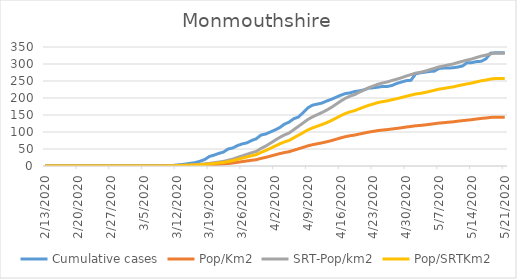
| Category | Cumulative cases | Pop/Km2 | SRT-Pop/km2 | Pop/SRTKm2 |
|---|---|---|---|---|
| 5/21/20 | 333 | 143.708 | 331.858 | 257.276 |
| 5/20/20 | 333 | 143.708 | 331.858 | 257.276 |
| 5/19/20 | 333 | 143.675 | 331.78 | 257.215 |
| 5/18/20 | 332 | 142.887 | 329.961 | 255.805 |
| 5/17/20 | 315 | 141.21 | 326.089 | 252.803 |
| 5/16/20 | 308 | 139.961 | 323.205 | 250.567 |
| 5/15/20 | 307 | 138.206 | 319.151 | 247.425 |
| 5/14/20 | 304 | 136.259 | 314.655 | 243.939 |
| 5/13/20 | 304 | 134.909 | 311.537 | 241.522 |
| 5/12/20 | 294 | 133.356 | 307.951 | 238.742 |
| 5/11/20 | 291 | 131.814 | 304.391 | 235.982 |
| 5/10/20 | 289 | 129.901 | 299.974 | 232.557 |
| 5/9/20 | 288 | 128.787 | 297.401 | 230.563 |
| 5/8/20 | 288 | 127.392 | 294.179 | 228.065 |
| 5/7/20 | 287 | 126.267 | 291.581 | 226.05 |
| 5/6/20 | 279 | 124.41 | 287.293 | 222.726 |
| 5/5/20 | 278 | 122.553 | 283.005 | 219.402 |
| 5/4/20 | 276 | 120.764 | 278.874 | 216.199 |
| 5/3/20 | 274 | 119.324 | 275.548 | 213.621 |
| 5/2/20 | 271 | 118.266 | 273.105 | 211.727 |
| 5/1/20 | 252 | 116.387 | 268.766 | 208.363 |
| 4/30/20 | 251 | 114.609 | 264.66 | 205.18 |
| 4/29/20 | 247 | 112.448 | 259.671 | 201.312 |
| 4/28/20 | 243 | 110.614 | 255.435 | 198.028 |
| 4/27/20 | 237 | 108.971 | 251.641 | 195.087 |
| 4/26/20 | 234 | 107.126 | 247.38 | 191.783 |
| 4/25/20 | 234 | 105.787 | 244.287 | 189.386 |
| 4/24/20 | 232 | 104.268 | 240.779 | 186.666 |
| 4/23/20 | 230 | 101.938 | 235.4 | 182.496 |
| 4/22/20 | 229 | 99.71 | 230.255 | 178.507 |
| 4/21/20 | 224 | 96.886 | 223.733 | 173.451 |
| 4/20/20 | 221 | 94.039 | 217.159 | 168.354 |
| 4/19/20 | 219 | 90.944 | 210.013 | 162.814 |
| 4/18/20 | 215 | 88.941 | 205.387 | 159.228 |
| 4/17/20 | 213 | 86.207 | 199.073 | 154.333 |
| 4/16/20 | 208 | 82.584 | 190.706 | 147.846 |
| 4/15/20 | 202 | 78.544 | 181.377 | 140.614 |
| 4/14/20 | 196 | 74.549 | 172.152 | 133.463 |
| 4/13/20 | 191 | 71.061 | 164.097 | 127.218 |
| 4/12/20 | 185 | 68.056 | 157.159 | 121.839 |
| 4/11/20 | 182 | 65.322 | 150.844 | 116.943 |
| 4/10/20 | 179 | 62.576 | 144.504 | 112.028 |
| 4/9/20 | 171 | 59.201 | 136.708 | 105.984 |
| 4/8/20 | 157 | 54.812 | 126.574 | 98.128 |
| 4/7/20 | 144 | 50.502 | 116.622 | 90.412 |
| 4/6/20 | 139 | 46.271 | 106.851 | 82.837 |
| 4/5/20 | 129 | 42.006 | 97.003 | 75.202 |
| 4/4/20 | 123 | 39.52 | 91.26 | 70.75 |
| 4/3/20 | 113 | 36.358 | 83.958 | 65.089 |
| 4/2/20 | 106 | 32.712 | 75.539 | 58.562 |
| 4/1/20 | 100 | 28.964 | 66.886 | 51.854 |
| 3/31/20 | 94 | 25.364 | 58.571 | 45.407 |
| 3/30/20 | 91 | 22.314 | 51.529 | 39.948 |
| 3/29/20 | 80 | 18.556 | 42.85 | 33.22 |
| 3/28/20 | 75 | 16.8 | 38.796 | 30.077 |
| 3/27/20 | 68 | 14.932 | 34.482 | 26.733 |
| 3/26/20 | 65 | 12.851 | 29.675 | 23.006 |
| 3/25/20 | 60 | 10.893 | 25.154 | 19.501 |
| 3/24/20 | 53 | 8.833 | 20.398 | 15.814 |
| 3/23/20 | 50 | 7.314 | 16.89 | 13.094 |
| 3/22/20 | 41 | 5.851 | 13.512 | 10.476 |
| 3/21/20 | 37 | 4.996 | 11.537 | 8.945 |
| 3/20/20 | 32 | 4.152 | 9.589 | 7.434 |
| 3/19/20 | 28 | 3.342 | 7.718 | 5.983 |
| 3/18/20 | 19 | 2.667 | 6.159 | 4.774 |
| 3/17/20 | 14 | 2.273 | 5.249 | 4.069 |
| 3/16/20 | 10 | 1.857 | 4.288 | 3.324 |
| 3/15/20 | 8 | 1.474 | 3.404 | 2.639 |
| 3/14/20 | 6 | 1.148 | 2.65 | 2.055 |
| 3/13/20 | 4 | 0.934 | 2.157 | 1.672 |
| 3/12/20 | 3 | 0.63 | 1.455 | 1.128 |
| 3/11/20 | 1 | 0.36 | 0.832 | 0.645 |
| 3/10/20 | 0 | 0.203 | 0.468 | 0.363 |
| 3/9/20 | 0 | 0.079 | 0.182 | 0.141 |
| 3/8/20 | 0 | 0.045 | 0.104 | 0.081 |
| 3/7/20 | 0 | 0.045 | 0.104 | 0.081 |
| 3/6/20 | 0 | 0.023 | 0.052 | 0.04 |
| 3/5/20 | 0 | 0.023 | 0.052 | 0.04 |
| 3/4/20 | 0 | 0.023 | 0.052 | 0.04 |
| 3/3/20 | 0 | 0.011 | 0.026 | 0.02 |
| 3/2/20 | 0 | 0.011 | 0.026 | 0.02 |
| 3/1/20 | 0 | 0.011 | 0.026 | 0.02 |
| 2/29/20 | 0 | 0.011 | 0.026 | 0.02 |
| 2/28/20 | 0 | 0.011 | 0.026 | 0.02 |
| 2/27/20 | 0 | 0.011 | 0.026 | 0.02 |
| 2/26/20 | 0 | 0 | 0 | 0 |
| 2/25/20 | 0 | 0 | 0 | 0 |
| 2/24/20 | 0 | 0 | 0 | 0 |
| 2/23/20 | 0 | 0 | 0 | 0 |
| 2/22/20 | 0 | 0 | 0 | 0 |
| 2/21/20 | 0 | 0 | 0 | 0 |
| 2/20/20 | 0 | 0 | 0 | 0 |
| 2/19/20 | 0 | 0 | 0 | 0 |
| 2/18/20 | 0 | 0 | 0 | 0 |
| 2/17/20 | 0 | 0 | 0 | 0 |
| 2/16/20 | 0 | 0 | 0 | 0 |
| 2/15/20 | 0 | 0 | 0 | 0 |
| 2/14/20 | 0 | 0 | 0 | 0 |
| 2/13/20 | 0 | 0 | 0 | 0 |